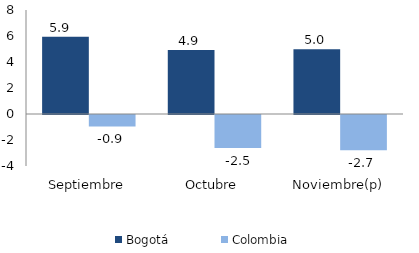
| Category | Bogotá | Colombia |
|---|---|---|
| Septiembre | 5.937 | -0.88 |
| Octubre | 4.924 | -2.537 |
| Noviembre(p) | 4.99 | -2.708 |